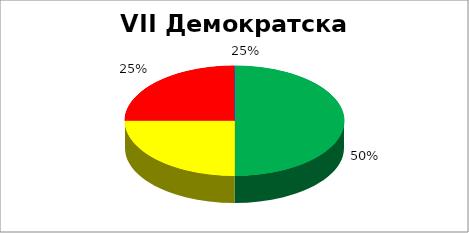
| Category | VII Демократска партиципација |
|---|---|
| 0 | 0.5 |
| 1 | 0 |
| 2 | 0.25 |
| 3 | 0.25 |
| 4 | 0 |